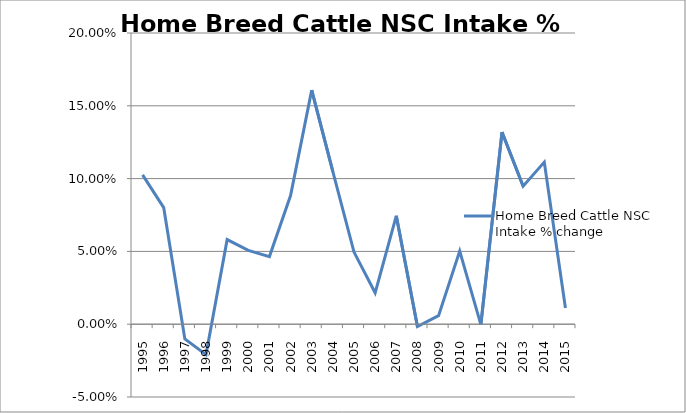
| Category | Home Breed Cattle NSC Intake % change |
|---|---|
| 1995.0 | 0.103 |
| 1996.0 | 0.08 |
| 1997.0 | -0.01 |
| 1998.0 | -0.021 |
| 1999.0 | 0.058 |
| 2000.0 | 0.051 |
| 2001.0 | 0.046 |
| 2002.0 | 0.088 |
| 2003.0 | 0.161 |
| 2004.0 | 0.105 |
| 2005.0 | 0.05 |
| 2006.0 | 0.022 |
| 2007.0 | 0.074 |
| 2008.0 | -0.002 |
| 2009.0 | 0.006 |
| 2010.0 | 0.05 |
| 2011.0 | 0 |
| 2012.0 | 0.132 |
| 2013.0 | 0.095 |
| 2014.0 | 0.111 |
| 2015.0 | 0.011 |